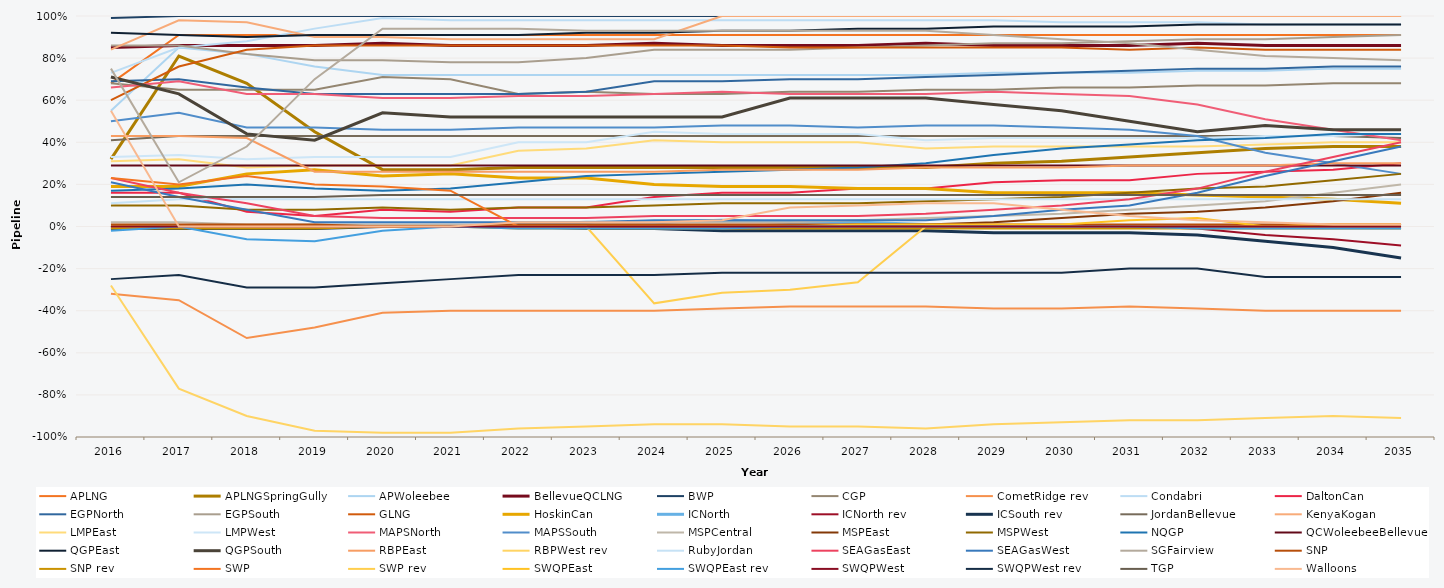
| Category | APLNG | APLNGSpringGully | APWoleebee | BellevueQCLNG | BWP | CGP | CometRidge rev | Condabri | DaltonCan | EGPNorth | EGPSouth | GLNG | HoskinCan | ICNorth | ICNorth rev | ICSouth rev | JordanBellevue | KenyaKogan | LMPEast | LMPWest | MAPSNorth | MAPSSouth | MSPCentral | MSPEast | MSPWest | NQGP | QCWoleebeeBellevue | QGPEast | QGPSouth | RBPEast | RBPWest rev | RubyJordan | SEAGasEast | SEAGasWest | SGFairview | SNP | SNP rev | SWP | SWP rev | SWQPEast | SWQPEast rev | SWQPWest | SWQPWest rev | TGP | Walloons |
|---|---|---|---|---|---|---|---|---|---|---|---|---|---|---|---|---|---|---|---|---|---|---|---|---|---|---|---|---|---|---|---|---|---|---|---|---|---|---|---|---|---|---|---|---|---|
| 2016.0 | 0.68 | 0.32 | 0.55 | 0.85 | 0.99 | 0.68 | -0.32 | 0.73 | 0.16 | 0.69 | 0.86 | 0.6 | 0.19 | 0 | 0 | -0.01 | 0.41 | 0.84 | 0.31 | 0.33 | 0.66 | 0.5 | 0.02 | 0 | 0.1 | 0.17 | 0.29 | 0.92 | 0.71 | 0.43 | -0.28 | 0.11 | 0.23 | 0.21 | 0.75 | 0.01 | -0.01 | 0.23 | 0 | 0 | -0.02 | 0 | -0.25 | 0.14 | 0.55 |
| 2017.0 | 0.91 | 0.81 | 0.85 | 0.86 | 1 | 0.65 | -0.35 | 0.85 | 0.16 | 0.7 | 0.86 | 0.76 | 0.19 | 0 | 0 | -0.01 | 0.43 | 0.98 | 0.32 | 0.34 | 0.69 | 0.54 | 0.02 | 0 | 0.1 | 0.18 | 0.29 | 0.91 | 0.63 | 0.43 | -0.77 | 0.13 | 0.16 | 0.14 | 0.21 | 0.01 | -0.01 | 0.2 | 0 | 0 | 0 | 0 | -0.23 | 0.14 | 0 |
| 2018.0 | 0.91 | 0.68 | 0.82 | 0.86 | 1 | 0.65 | -0.53 | 0.88 | 0.07 | 0.66 | 0.82 | 0.84 | 0.25 | 0 | 0 | -0.01 | 0.43 | 0.97 | 0.28 | 0.32 | 0.63 | 0.47 | 0.01 | 0 | 0.08 | 0.2 | 0.29 | 0.9 | 0.44 | 0.42 | -0.9 | 0.13 | 0.11 | 0.08 | 0.38 | 0.01 | -0.01 | 0.24 | 0 | 0 | -0.06 | 0 | -0.29 | 0.14 | 0 |
| 2019.0 | 0.91 | 0.45 | 0.76 | 0.86 | 1 | 0.65 | -0.48 | 0.94 | 0.05 | 0.63 | 0.79 | 0.86 | 0.27 | 0 | 0 | -0.01 | 0.43 | 0.9 | 0.29 | 0.33 | 0.63 | 0.47 | 0.01 | 0 | 0.08 | 0.18 | 0.29 | 0.91 | 0.41 | 0.26 | -0.97 | 0.13 | 0.05 | 0.02 | 0.7 | 0.01 | -0.01 | 0.2 | 0 | 0 | -0.07 | 0 | -0.29 | 0.14 | 0 |
| 2020.0 | 0.91 | 0.27 | 0.72 | 0.87 | 1 | 0.71 | -0.41 | 0.99 | 0.08 | 0.63 | 0.79 | 0.86 | 0.24 | 0 | 0 | 0 | 0.43 | 0.9 | 0.29 | 0.33 | 0.61 | 0.46 | 0.01 | 0 | 0.09 | 0.17 | 0.29 | 0.91 | 0.54 | 0.26 | -0.98 | 0.13 | 0.04 | 0.02 | 0.94 | 0 | 0 | 0.19 | 0 | 0 | -0.02 | 0 | -0.27 | 0.15 | 0 |
| 2021.0 | 0.91 | 0.27 | 0.72 | 0.86 | 1 | 0.7 | -0.4 | 0.98 | 0.07 | 0.63 | 0.78 | 0.86 | 0.25 | 0 | 0 | 0 | 0.43 | 0.89 | 0.29 | 0.33 | 0.61 | 0.46 | 0.01 | 0 | 0.08 | 0.18 | 0.29 | 0.91 | 0.52 | 0.26 | -0.98 | 0.13 | 0.04 | 0.02 | 0.94 | 0 | 0 | 0.17 | 0 | 0 | 0 | 0 | -0.25 | 0.15 | 0 |
| 2022.0 | 0.91 | 0.28 | 0.72 | 0.86 | 1 | 0.63 | -0.4 | 0.98 | 0.09 | 0.63 | 0.78 | 0.86 | 0.23 | 0.01 | 0 | 0 | 0.43 | 0.89 | 0.36 | 0.4 | 0.62 | 0.47 | 0.01 | 0 | 0.09 | 0.21 | 0.29 | 0.91 | 0.52 | 0.26 | -0.96 | 0.13 | 0.04 | 0.02 | 0.94 | 0.01 | -0.01 | 0 | 0 | 0 | -0.01 | 0 | -0.23 | 0.15 | 0.02 |
| 2023.0 | 0.91 | 0.28 | 0.72 | 0.86 | 1 | 0.64 | -0.4 | 0.98 | 0.09 | 0.64 | 0.8 | 0.86 | 0.23 | 0.02 | 0 | -0.01 | 0.43 | 0.89 | 0.37 | 0.4 | 0.62 | 0.47 | 0.01 | 0 | 0.09 | 0.24 | 0.29 | 0.92 | 0.52 | 0.26 | -0.95 | 0.13 | 0.04 | 0.02 | 0.93 | 0.01 | -0.01 | 0 | 0 | 0 | -0.01 | 0 | -0.23 | 0.15 | 0.02 |
| 2024.0 | 0.91 | 0.28 | 0.72 | 0.87 | 1 | 0.63 | -0.4 | 0.98 | 0.14 | 0.69 | 0.84 | 0.86 | 0.2 | 0.02 | 0 | -0.01 | 0.43 | 0.89 | 0.41 | 0.45 | 0.63 | 0.47 | 0.02 | 0 | 0.1 | 0.25 | 0.29 | 0.92 | 0.52 | 0.26 | -0.94 | 0.13 | 0.05 | 0.03 | 0.93 | 0.01 | -0.01 | 0 | -0.365 | 0 | -0.01 | 0 | -0.23 | 0.15 | 0.02 |
| 2025.0 | 0.91 | 0.28 | 0.72 | 0.86 | 1 | 0.63 | -0.39 | 0.98 | 0.16 | 0.69 | 0.84 | 0.86 | 0.19 | 0.03 | 0 | -0.02 | 0.43 | 1 | 0.4 | 0.44 | 0.64 | 0.48 | 0.02 | 0 | 0.11 | 0.26 | 0.29 | 0.93 | 0.52 | 0.27 | -0.94 | 0.13 | 0.05 | 0.03 | 0.93 | 0.01 | -0.01 | 0 | -0.315 | 0 | -0.01 | 0 | -0.22 | 0.15 | 0.03 |
| 2026.0 | 0.91 | 0.28 | 0.72 | 0.86 | 1 | 0.64 | -0.38 | 0.98 | 0.16 | 0.7 | 0.84 | 0.85 | 0.19 | 0.02 | 0 | -0.02 | 0.43 | 1 | 0.4 | 0.44 | 0.63 | 0.48 | 0.02 | 0 | 0.11 | 0.27 | 0.29 | 0.93 | 0.61 | 0.27 | -0.95 | 0.13 | 0.05 | 0.03 | 0.93 | 0.01 | -0.01 | 0 | -0.3 | 0 | 0 | 0 | -0.22 | 0.15 | 0.09 |
| 2027.0 | 0.91 | 0.28 | 0.72 | 0.86 | 1 | 0.64 | -0.38 | 0.98 | 0.18 | 0.7 | 0.85 | 0.85 | 0.18 | 0.02 | 0 | -0.02 | 0.43 | 1 | 0.4 | 0.44 | 0.63 | 0.47 | 0.03 | 0.01 | 0.11 | 0.28 | 0.29 | 0.94 | 0.61 | 0.27 | -0.95 | 0.13 | 0.05 | 0.03 | 0.93 | 0.01 | -0.01 | 0 | -0.265 | 0.01 | 0 | 0 | -0.22 | 0.15 | 0.1 |
| 2028.0 | 0.91 | 0.28 | 0.72 | 0.87 | 1 | 0.65 | -0.38 | 0.98 | 0.18 | 0.71 | 0.86 | 0.85 | 0.18 | 0.01 | 0 | -0.02 | 0.43 | 1 | 0.37 | 0.41 | 0.63 | 0.48 | 0.04 | 0.01 | 0.12 | 0.3 | 0.29 | 0.94 | 0.61 | 0.28 | -0.96 | 0.13 | 0.06 | 0.03 | 0.93 | 0.01 | -0.01 | 0 | 0 | 0.01 | 0 | 0 | -0.22 | 0.15 | 0.11 |
| 2029.0 | 0.91 | 0.3 | 0.73 | 0.86 | 1 | 0.65 | -0.39 | 0.98 | 0.21 | 0.72 | 0.87 | 0.85 | 0.16 | 0 | 0 | -0.03 | 0.43 | 1 | 0.38 | 0.42 | 0.64 | 0.48 | 0.05 | 0.02 | 0.13 | 0.34 | 0.29 | 0.95 | 0.58 | 0.28 | -0.94 | 0.13 | 0.08 | 0.05 | 0.91 | 0.01 | -0.01 | 0 | 0 | 0.01 | 0 | 0 | -0.22 | 0.15 | 0.11 |
| 2030.0 | 0.91 | 0.31 | 0.73 | 0.86 | 1 | 0.66 | -0.39 | 0.97 | 0.22 | 0.73 | 0.87 | 0.85 | 0.16 | 0 | 0 | -0.03 | 0.43 | 1 | 0.38 | 0.42 | 0.63 | 0.47 | 0.06 | 0.04 | 0.14 | 0.37 | 0.29 | 0.95 | 0.55 | 0.28 | -0.93 | 0.13 | 0.1 | 0.08 | 0.89 | 0.01 | -0.01 | 0 | 0 | 0.01 | 0 | 0 | -0.22 | 0.15 | 0.08 |
| 2031.0 | 0.91 | 0.33 | 0.73 | 0.86 | 1 | 0.66 | -0.38 | 0.97 | 0.22 | 0.74 | 0.88 | 0.84 | 0.16 | 0 | 0 | -0.03 | 0.43 | 1 | 0.38 | 0.42 | 0.62 | 0.46 | 0.08 | 0.06 | 0.16 | 0.39 | 0.29 | 0.95 | 0.5 | 0.29 | -0.92 | 0.13 | 0.13 | 0.1 | 0.87 | 0.01 | -0.01 | 0 | 0 | 0.03 | 0 | 0 | -0.2 | 0.15 | 0.05 |
| 2032.0 | 0.91 | 0.35 | 0.74 | 0.87 | 1 | 0.67 | -0.39 | 0.97 | 0.25 | 0.75 | 0.89 | 0.85 | 0.15 | 0 | -0.01 | -0.04 | 0.43 | 1 | 0.38 | 0.42 | 0.58 | 0.43 | 0.1 | 0.07 | 0.18 | 0.41 | 0.29 | 0.96 | 0.45 | 0.29 | -0.92 | 0.13 | 0.18 | 0.16 | 0.84 | 0.01 | -0.01 | 0 | 0 | 0.04 | -0.01 | 0 | -0.2 | 0.15 | 0.03 |
| 2033.0 | 0.91 | 0.37 | 0.74 | 0.86 | 1 | 0.67 | -0.4 | 0.96 | 0.26 | 0.75 | 0.89 | 0.84 | 0.14 | 0 | -0.04 | -0.07 | 0.43 | 1 | 0.39 | 0.43 | 0.51 | 0.35 | 0.12 | 0.09 | 0.19 | 0.42 | 0.29 | 0.96 | 0.48 | 0.29 | -0.91 | 0.13 | 0.26 | 0.24 | 0.81 | 0.01 | -0.01 | 0 | 0 | 0 | -0.01 | 0 | -0.24 | 0.15 | 0.02 |
| 2034.0 | 0.91 | 0.38 | 0.75 | 0.86 | 1 | 0.68 | -0.4 | 0.96 | 0.27 | 0.76 | 0.9 | 0.84 | 0.13 | 0 | -0.06 | -0.1 | 0.43 | 1 | 0.4 | 0.43 | 0.46 | 0.3 | 0.16 | 0.12 | 0.22 | 0.44 | 0.29 | 0.96 | 0.46 | 0.3 | -0.9 | 0.13 | 0.33 | 0.31 | 0.8 | 0.01 | -0.01 | 0.01 | 0 | 0.01 | -0.01 | 0 | -0.24 | 0.15 | 0.01 |
| 2035.0 | 0.91 | 0.38 | 0.75 | 0.86 | 1 | 0.68 | -0.4 | 0.96 | 0.3 | 0.76 | 0.91 | 0.84 | 0.11 | 0 | -0.09 | -0.15 | 0.42 | 1 | 0.4 | 0.44 | 0.41 | 0.25 | 0.2 | 0.16 | 0.25 | 0.44 | 0.29 | 0.96 | 0.46 | 0.3 | -0.91 | 0.13 | 0.4 | 0.38 | 0.79 | 0.01 | -0.01 | 0.01 | 0 | 0.01 | -0.01 | 0 | -0.24 | 0.15 | 0.01 |